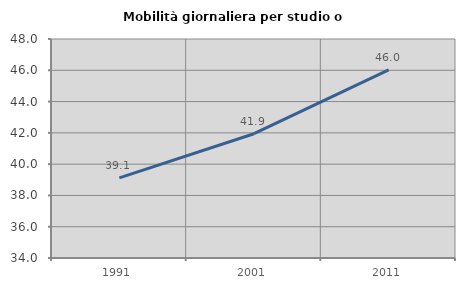
| Category | Mobilità giornaliera per studio o lavoro |
|---|---|
| 1991.0 | 39.118 |
| 2001.0 | 41.946 |
| 2011.0 | 46.024 |